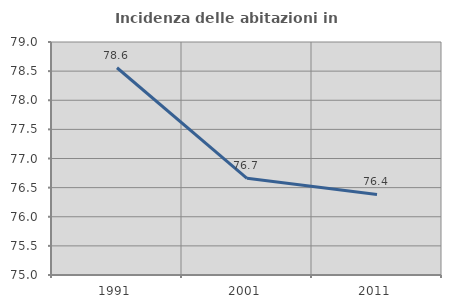
| Category | Incidenza delle abitazioni in proprietà  |
|---|---|
| 1991.0 | 78.558 |
| 2001.0 | 76.66 |
| 2011.0 | 76.383 |